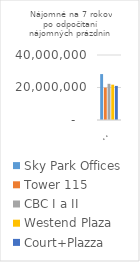
| Category | Sky Park Offices | Tower 115 | CBC I a II | Westend Plaza | Court+Plazza |
|---|---|---|---|---|---|
| 18756,44 m2 | 28255194.66 | 19928339.28 | 22277023.788 | 21743024.85 | 20978024.85 |